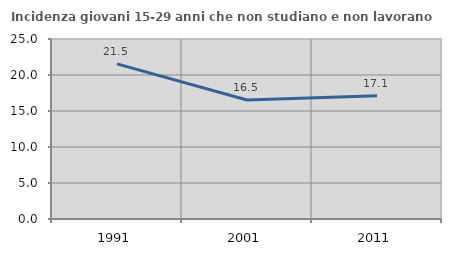
| Category | Incidenza giovani 15-29 anni che non studiano e non lavorano  |
|---|---|
| 1991.0 | 21.547 |
| 2001.0 | 16.518 |
| 2011.0 | 17.13 |